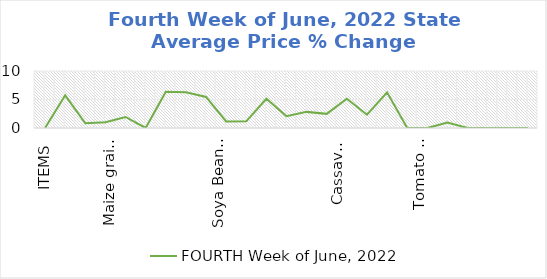
| Category | FOURTH Week of June, 2022 |
|---|---|
| ITEMS | 0 |
| Rice, Imported, High Quality Sold loose  (1 mudu) | 5.735 |
| Rice, Agric Sold Loose(Low quality) imported  (1 mudu) | 0.84 |
| Rice Local, Sold Loose   (1 mudu) | 1.029 |
| Maize grain, white sold loose   (1 mudu) | 1.935 |
| Maize grain, yellow sold loose   (1 mudu) | 0 |
| Sorghum (Guinea Corn) white or brown, sold loose   (1 mudu) | 6.349 |
| millet (jero or maiwa) sold loose   (1 mudu) | 6.283 |
| Beans: white black eye. Sold loose   (1 mudu) | 5.444 |
| Beans Brown, sold loose  (1 mudu) | 1.156 |
| Soya Beans, sold loose    (1 mudu) | 1.167 |
| Gari White, sold loose  (1 mudu) | 5.13 |
| Gari Yellow, sold loose   (1 mudu) | 2.066 |
| Palm oil (1 schnap bottle) | 2.828 |
| Yam tuber (1 Medium Size) | 2.482 |
| Cassava tuber | 5.146 |
| Irish potato  (4 Litre rubber) | 2.338 |
| Sweet potato  (5 Medium Size) | 6.25 |
| Local live chicken  | 0 |
| Groundnut - shelled (fresh) | 0 |
| Tomato fresh   (4 Litre rubber) | 0.943 |
| Okro fresh     (1 mudu) | 0 |
| Okro dried    (1 mudu) | 0 |
| Onion   (4 Litre rubber) | 0 |
| Pepper fresh   (4 Litre rubber) | 0 |